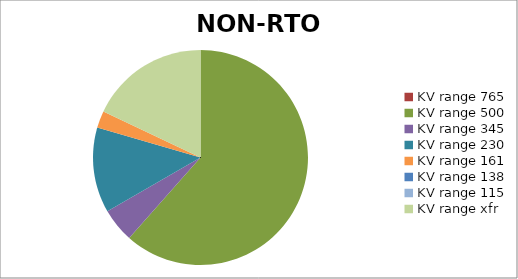
| Category | NON-RTO SERC |
|---|---|
| 0 | 0 |
| 1 | 24 |
| 2 | 2 |
| 3 | 5 |
| 4 | 1 |
| 5 | 0 |
| 6 | 0 |
| 7 | 7 |